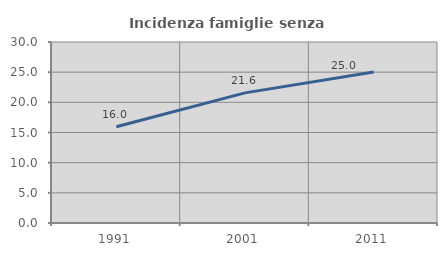
| Category | Incidenza famiglie senza nuclei |
|---|---|
| 1991.0 | 15.965 |
| 2001.0 | 21.568 |
| 2011.0 | 25.022 |